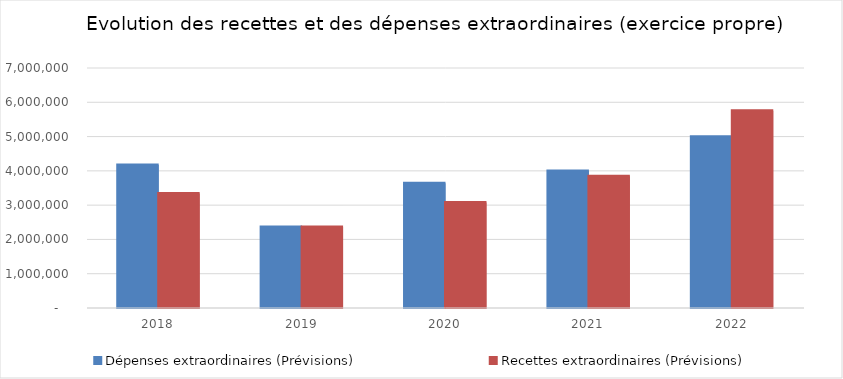
| Category | Dépenses extraordinaires (Prévisions) | Recettes extraordinaires (Prévisions) |
|---|---|---|
| 2018.0 | 4168831.99 | 3337645 |
| 2019.0 | 2360512.55 | 2365949.76 |
| 2020.0 | 3637322.74 | 3079666.04 |
| 2021.0 | 3995382.74 | 3841790 |
| 2022.0 | 4991432.74 | 5750605.48 |